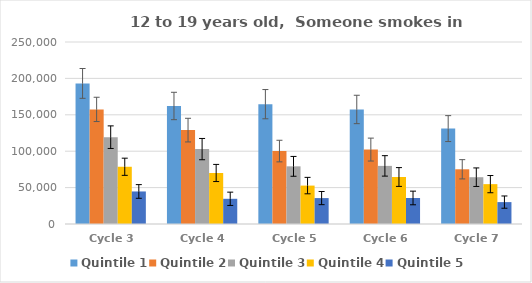
| Category | Quintile 1 | Quintile 2 | Quintile 3 | Quintile 4 | Quintile 5 |
|---|---|---|---|---|---|
| Cycle 3 | 193113 | 157411 | 119266 | 78620 | 44701 |
| Cycle 4 | 162108 | 128965 | 102883 | 70073 | 34615 |
| Cycle 5 | 164606 | 100175 | 79202 | 52763 | 35603 |
| Cycle 6 | 157339 | 102231 | 79812 | 64555 | 35752 |
| Cycle 7 | 131043 | 75158 | 64286 | 54758 | 30079 |